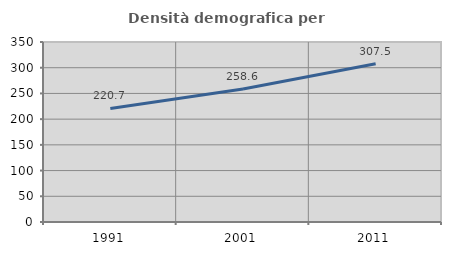
| Category | Densità demografica |
|---|---|
| 1991.0 | 220.699 |
| 2001.0 | 258.592 |
| 2011.0 | 307.517 |